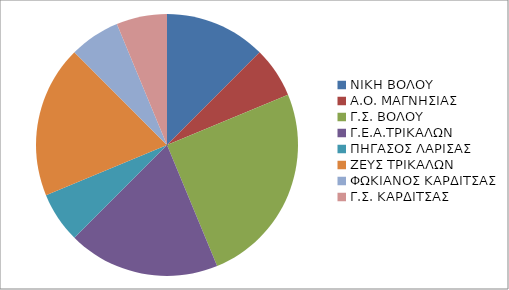
| Category | Series 0 |
|---|---|
| ΝΙΚΗ ΒΟΛΟΥ | 2 |
| Α.Ο. ΜΑΓΝΗΣΙΑΣ | 1 |
| Γ.Σ. ΒΟΛΟΥ | 4 |
| Γ.Ε.Α.ΤΡΙΚΑΛΩΝ | 3 |
| ΠΗΓΑΣΟΣ ΛΑΡΙΣΑΣ | 1 |
| ΖΕΥΣ ΤΡΙΚΑΛΩΝ | 3 |
| ΦΩΚΙΑΝΟΣ ΚΑΡΔΙΤΣΑΣ | 1 |
| Γ.Σ. ΚΑΡΔΙΤΣΑΣ | 1 |